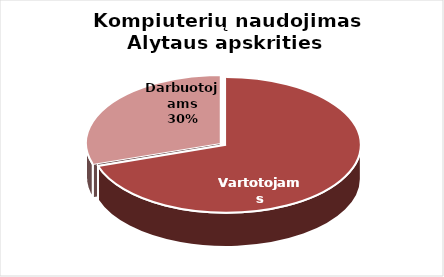
| Category | Series 0 |
|---|---|
| Vartotojams | 461 |
| Darbuotojams | 198 |